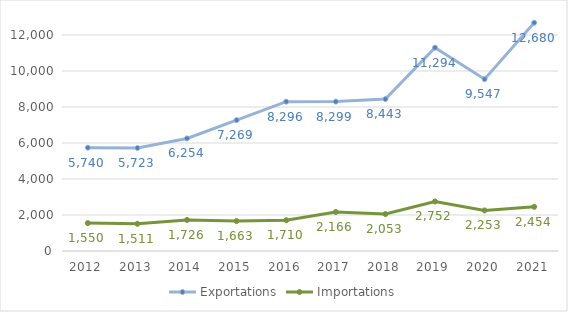
| Category | Exportations | Importations |
|---|---|---|
| 2012 | 5740 | 1550 |
| 2013 | 5723 | 1511 |
| 2014 | 6254 | 1726 |
| 2015 | 7269 | 1663 |
| 2016 | 8296.374 | 1710.28 |
| 2017 | 8299 | 2166 |
| 2018 | 8443 | 2053 |
| 2019 | 11294.434 | 2751.543 |
| 2020 | 9547.466 | 2252.965 |
| 2021 | 12679.644 | 2453.837 |